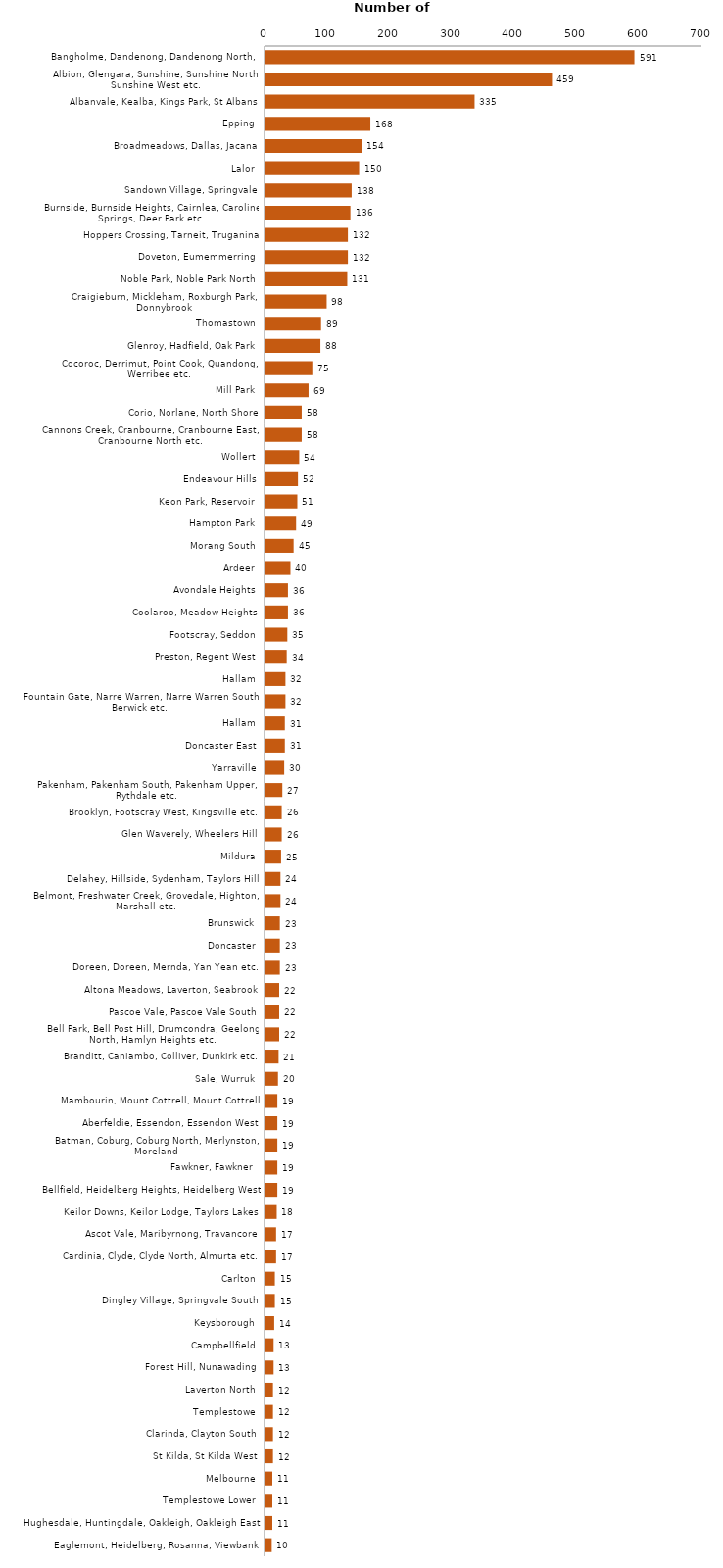
| Category | Suburb of Residence |
|---|---|
| Bangholme, Dandenong, Dandenong North,  | 591 |
| Albion, Glengara, Sunshine, Sunshine North, Sunshine West etc. | 459 |
| Albanvale, Kealba, Kings Park, St Albans | 335 |
| Epping | 168 |
| Broadmeadows, Dallas, Jacana | 154 |
| Lalor | 150 |
| Sandown Village, Springvale | 138 |
| Burnside, Burnside Heights, Cairnlea, Caroline Springs, Deer Park etc. | 136 |
| Hoppers Crossing, Tarneit, Truganina | 132 |
| Doveton, Eumemmerring | 132 |
| Noble Park, Noble Park North | 131 |
| Craigieburn, Mickleham, Roxburgh Park, Donnybrook | 98 |
| Thomastown | 89 |
| Glenroy, Hadfield, Oak Park | 88 |
| Cocoroc, Derrimut, Point Cook, Quandong, Werribee etc. | 75 |
| Mill Park | 69 |
| Corio, Norlane, North Shore | 58 |
| Cannons Creek, Cranbourne, Cranbourne East, Cranbourne North etc. | 58 |
| Wollert | 54 |
| Endeavour Hills | 52 |
| Keon Park, Reservoir | 51 |
| Hampton Park | 49 |
| Morang South | 45 |
| Ardeer | 40 |
| Avondale Heights | 36 |
| Coolaroo, Meadow Heights | 36 |
| Footscray, Seddon | 35 |
| Preston, Regent West | 34 |
| Hallam | 32 |
| Fountain Gate, Narre Warren, Narre Warren South, Berwick etc. | 32 |
| Hallam | 31 |
| Doncaster East | 31 |
| Yarraville | 30 |
| Pakenham, Pakenham South, Pakenham Upper, Rythdale etc. | 27 |
| Brooklyn, Footscray West, Kingsville etc. | 26 |
| Glen Waverely, Wheelers Hill | 26 |
| Mildura | 25 |
| Delahey, Hillside, Sydenham, Taylors Hill | 24 |
| Belmont, Freshwater Creek, Grovedale, Highton, Marshall etc. | 24 |
| Brunswick | 23 |
| Doncaster | 23 |
| Doreen, Doreen, Mernda, Yan Yean etc. | 23 |
| Altona Meadows, Laverton, Seabrook | 22 |
| Pascoe Vale, Pascoe Vale South | 22 |
| Bell Park, Bell Post Hill, Drumcondra, Geelong North, Hamlyn Heights etc. | 22 |
| Branditt, Caniambo, Colliver, Dunkirk etc. | 21 |
| Sale, Wurruk | 20 |
| Mambourin, Mount Cottrell, Mount Cottrell | 19 |
| Aberfeldie, Essendon, Essendon West | 19 |
| Batman, Coburg, Coburg North, Merlynston, Moreland | 19 |
| Fawkner, Fawkner | 19 |
| Bellfield, Heidelberg Heights, Heidelberg West | 19 |
| Keilor Downs, Keilor Lodge, Taylors Lakes | 18 |
| Ascot Vale, Maribyrnong, Travancore | 17 |
| Cardinia, Clyde, Clyde North, Almurta etc. | 17 |
| Carlton | 15 |
| Dingley Village, Springvale South | 15 |
| Keysborough | 14 |
| Campbellfield | 13 |
| Forest Hill, Nunawading | 13 |
| Laverton North | 12 |
| Templestowe | 12 |
| Clarinda, Clayton South | 12 |
| St Kilda, St Kilda West | 12 |
| Melbourne | 11 |
| Templestowe Lower | 11 |
| Hughesdale, Huntingdale, Oakleigh, Oakleigh East | 11 |
| Eaglemont, Heidelberg, Rosanna, Viewbank | 10 |